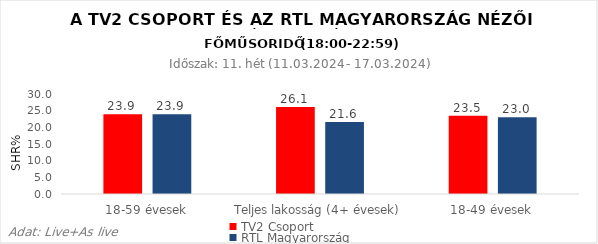
| Category | TV2 Csoport | RTL Magyarország |
|---|---|---|
| 18-59 évesek | 23.9 | 23.9 |
| Teljes lakosság (4+ évesek) | 26.1 | 21.6 |
| 18-49 évesek | 23.5 | 23 |